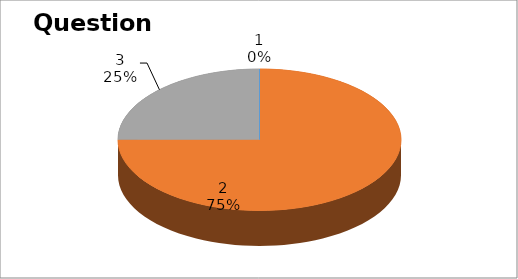
| Category | Series 0 |
|---|---|
| 0 | 0 |
| 1 | 6 |
| 2 | 2 |